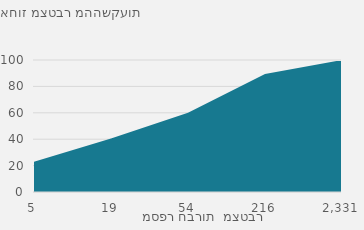
| Category | אחוז מצטבר מסך ההשקעה |
|---|---|
| 5.0 | 22.997 |
| 19.0 | 40.606 |
| 54.0 | 60.024 |
| 216.0 | 89.41 |
| 2331.0 | 100 |